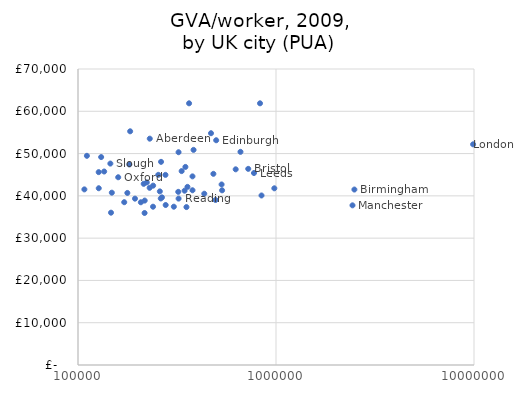
| Category | GVA growth |
|---|---|
| 230400.0 | 53525.91 |
| 183400.0 | 55266.68 |
| 239300.0 | 37434.11 |
| 181700.0 | 47424.45 |
| 320900.0 | 40947.88 |
| 2488200.0 | 41492.84 |
| 146800.0 | 36022.59 |
| 216900.0 | 35949.1 |
| 482800.0 | 45207.55 |
| 531200.0 | 42693.26 |
| 348700.0 | 46841.93 |
| 724000.0 | 46386.38 |
| 177500.0 | 40688.02 |
| 130900.0 | 49172.49 |
| 357200.0 | 42123.05 |
| 276500.0 | 44958.69 |
| 345400.0 | 41222.33 |
| 110900.0 | 49467.28 |
| 254300.0 | 44970.78 |
| 304800.0 | 37434.11 |
| 148200.0 | 40748.89 |
| 498800.0 | 53150.71 |
| 127300.0 | 41800.17 |
| 980800.0 | 41785.13 |
| 127200.0 | 45609.3 |
| 434300.0 | 40506.9 |
| 259000.0 | 41059.86 |
| 135600.0 | 45757.51 |
| 774100.0 | 45399.8 |
| 495000.0 | 39020.05 |
| 625800.0 | 46276.47 |
| 214700.0 | 52189.2 |
| 2434100.0 | 42839.95 |
| 230100.0 | 37756.64 |
| 469600.0 | 41901.62 |
| 261800.0 | 54810.67 |
| 845000.0 | 39384.05 |
| 239600.0 | 40090.23 |
| 222500.0 | 42417.67 |
| 265500.0 | 43168.41 |
| 661600.0 | 39640.43 |
| 159600.0 | 50408.22 |
| 194000.0 | 44398.19 |
| 262700.0 | 39338.97 |
| 534200.0 | 48041.76 |
| 363900.0 | 41310.82 |
| 322100.0 | 61884.96 |
| 830500.0 | 39351.65 |
| 145700.0 | 61884.96 |
| 378600.0 | 47634.48 |
| 353000.0 | 44609.05 |
| 378700.0 | 37347.42 |
| 277200.0 | 41323.02 |
| 383400.0 | 37834.95 |
| 217200.0 | 50870.87 |
| 171200.0 | 38885.07 |
| 333800.0 | 38499.18 |
| 207700.0 | 45854.85 |
| 322000.0 | 38480.98 |
| 107700.0 | 50316.49 |
| 206900.0 | 41530.27 |